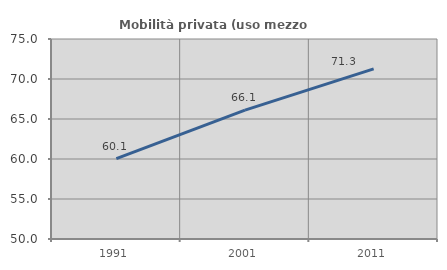
| Category | Mobilità privata (uso mezzo privato) |
|---|---|
| 1991.0 | 60.052 |
| 2001.0 | 66.103 |
| 2011.0 | 71.269 |